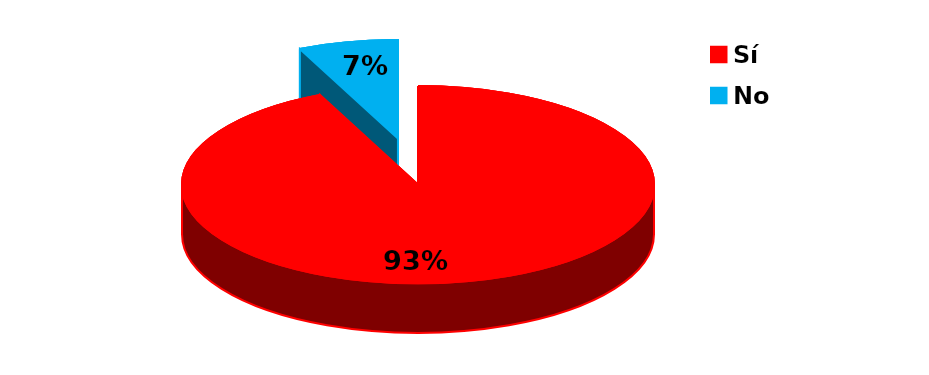
| Category | Series 0 |
|---|---|
| Sí | 41 |
| No | 3 |